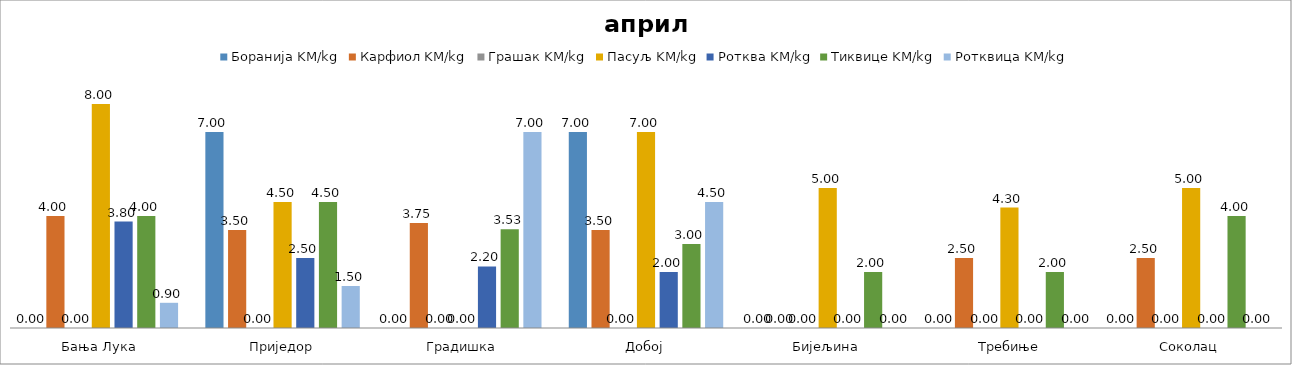
| Category | Боранија KM/kg | Карфиол KM/kg | Грашак KM/kg | Пасуљ KM/kg | Ротква KM/kg | Тиквице KM/kg | Ротквица KM/kg |
|---|---|---|---|---|---|---|---|
| Бања Лука | 0 | 4 | 0 | 8 | 3.8 | 4 | 0.9 |
| Приједор | 7 | 3.5 | 0 | 4.5 | 2.5 | 4.5 | 1.5 |
| Градишка | 0 | 3.75 | 0 | 0 | 2.2 | 3.525 | 7 |
| Добој | 7 | 3.5 | 0 | 7 | 2 | 3 | 4.5 |
| Бијељина | 0 | 0 | 0 | 5 | 0 | 2 | 0 |
|  Требиње | 0 | 2.5 | 0 | 4.3 | 0 | 2 | 0 |
| Соколац | 0 | 2.5 | 0 | 5 | 0 | 4 | 0 |